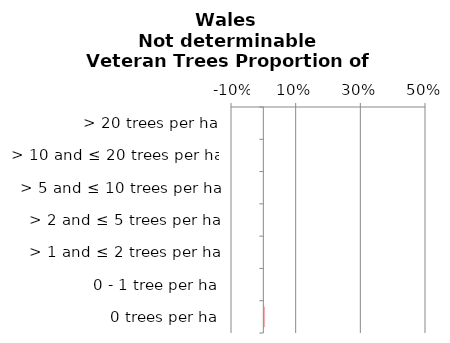
| Category | Not determinable |
|---|---|
| 0 trees per ha | 0.002 |
| 0 - 1 tree per ha | 0 |
| > 1 and ≤ 2 trees per ha | 0 |
| > 2 and ≤ 5 trees per ha | 0 |
| > 5 and ≤ 10 trees per ha | 0 |
| > 10 and ≤ 20 trees per ha | 0 |
| > 20 trees per ha | 0 |